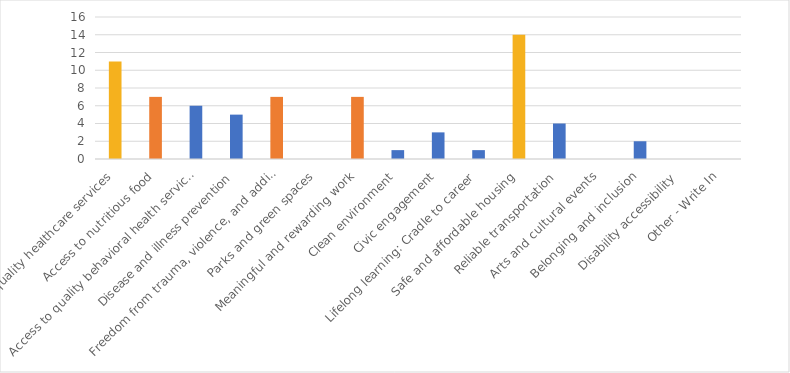
| Category | Number of Responses |
|---|---|
| Access to quality healthcare services | 11 |
| Access to nutritious food | 7 |
| Access to quality behavioral health services | 6 |
| Disease and illness prevention | 5 |
| Freedom from trauma, violence, and addiction | 7 |
| Parks and green spaces | 0 |
| Meaningful and rewarding work | 7 |
| Clean environment | 1 |
| Civic engagement | 3 |
| Lifelong learning: Cradle to career | 1 |
| Safe and affordable housing | 14 |
| Reliable transportation | 4 |
| Arts and cultural events | 0 |
| Belonging and inclusion | 2 |
| Disability accessibility | 0 |
| Other - Write In | 0 |